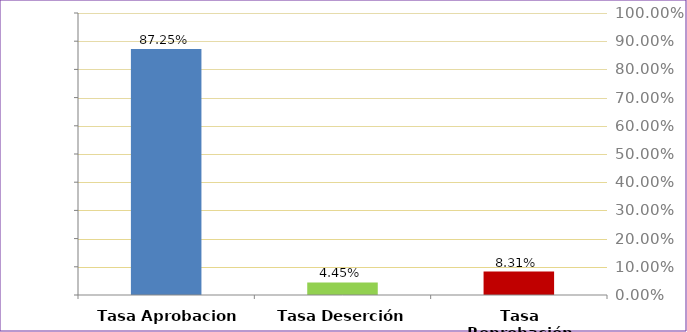
| Category | Total |
|---|---|
| Tasa Aprobacion | 0.872 |
| Tasa Deserción | 0.044 |
| Tasa Reprobación | 0.083 |